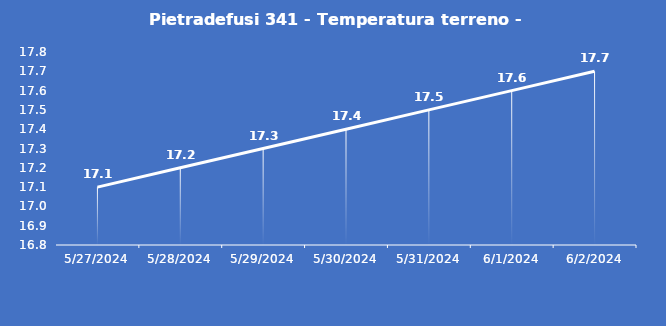
| Category | Pietradefusi 341 - Temperatura terreno - Grezzo (°C) |
|---|---|
| 5/27/24 | 17.1 |
| 5/28/24 | 17.2 |
| 5/29/24 | 17.3 |
| 5/30/24 | 17.4 |
| 5/31/24 | 17.5 |
| 6/1/24 | 17.6 |
| 6/2/24 | 17.7 |